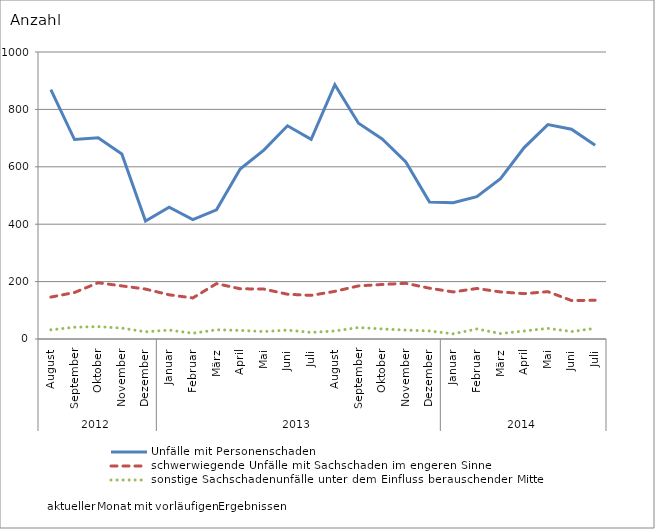
| Category | Unfälle mit Personenschaden | schwerwiegende Unfälle mit Sachschaden im engeren Sinne | sonstige Sachschadenunfälle unter dem Einfluss berauschender Mittel |
|---|---|---|---|
| 0 | 869 | 146 | 32 |
| 1 | 695 | 162 | 41 |
| 2 | 701 | 196 | 43 |
| 3 | 645 | 185 | 38 |
| 4 | 411 | 174 | 25 |
| 5 | 459 | 154 | 31 |
| 6 | 416 | 143 | 20 |
| 7 | 450 | 193 | 32 |
| 8 | 592 | 175 | 30 |
| 9 | 658 | 174 | 26 |
| 10 | 743 | 156 | 31 |
| 11 | 696 | 152 | 23 |
| 12 | 886 | 166 | 28 |
| 13 | 752 | 185 | 40 |
| 14 | 697 | 190 | 35 |
| 15 | 617 | 194 | 31 |
| 16 | 477 | 177 | 28 |
| 17 | 475 | 164 | 18 |
| 18 | 496 | 176 | 35 |
| 19 | 559 | 164 | 19 |
| 20 | 667 | 158 | 28 |
| 21 | 747 | 165 | 37 |
| 22 | 731 | 134 | 26 |
| 23 | 675 | 135 | 37 |